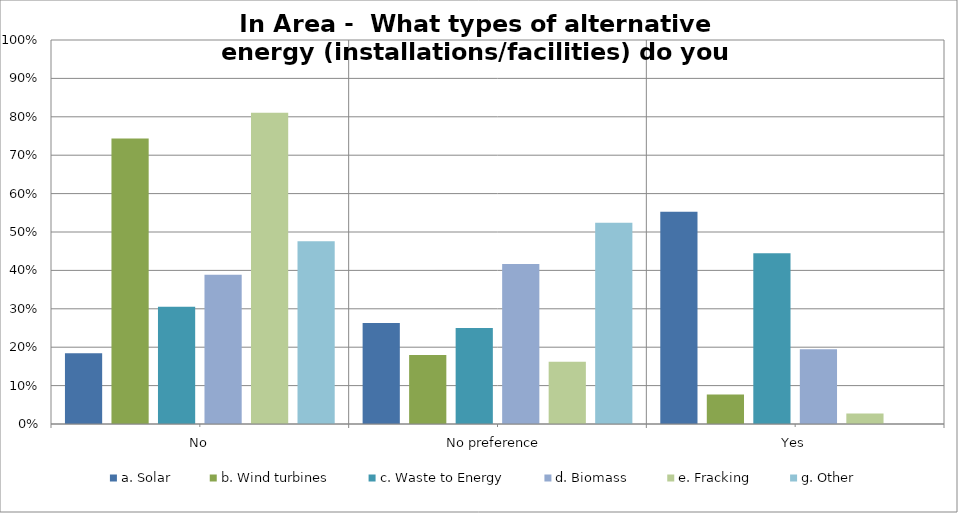
| Category | a. Solar | b. Wind turbines | c. Waste to Energy | d. Biomass | e. Fracking | g. Other |
|---|---|---|---|---|---|---|
| No | 0.184 | 0.744 | 0.306 | 0.389 | 0.811 | 0.476 |
| No preference  | 0.263 | 0.179 | 0.25 | 0.417 | 0.162 | 0.524 |
| Yes | 0.553 | 0.077 | 0.444 | 0.194 | 0.027 | 0 |